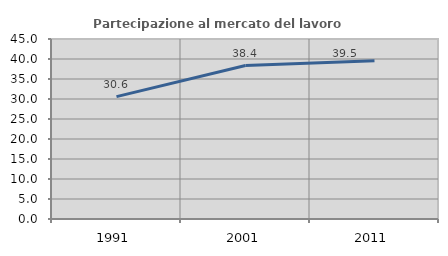
| Category | Partecipazione al mercato del lavoro  femminile |
|---|---|
| 1991.0 | 30.599 |
| 2001.0 | 38.375 |
| 2011.0 | 39.535 |